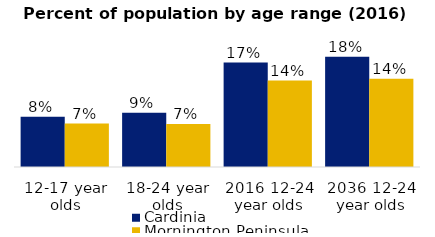
| Category | Cardinia | Mornington Peninsula |
|---|---|---|
| 12-17 year olds | 0.082 | 0.071 |
| 18-24 year olds | 0.088 | 0.07 |
| 2016 12-24 year olds | 0.17 | 0.141 |
| 2036 12-24 year olds | 0.179 | 0.144 |